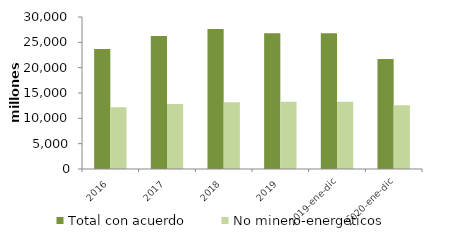
| Category | Total con acuerdo | No minero-energéticos |
|---|---|---|
| 2016 | 23672.225 | 12175.65 |
| 2017 | 26258.699 | 12814.346 |
| 2018 | 27644.039 | 13160.804 |
| 2019 | 26809.229 | 13265.46 |
| 2019-ene-dic | 26809.229 | 13265.46 |
| 2020-ene-dic | 21714.509 | 12575.035 |